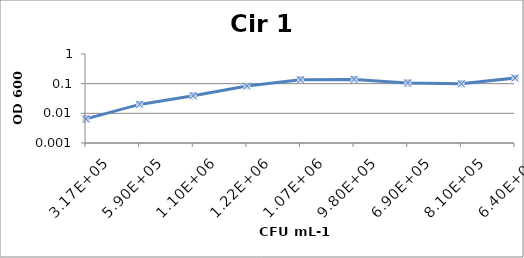
| Category | Cir 1 |
|---|---|
| 316666.666666667 | 0.006 |
| 590000.0 | 0.02 |
| 1103333.33333333 | 0.039 |
| 1223333.33333333 | 0.083 |
| 1070000.0 | 0.135 |
| 980000.0 | 0.139 |
| 690000.0 | 0.106 |
| 810000.0 | 0.099 |
| 640000.0 | 0.155 |